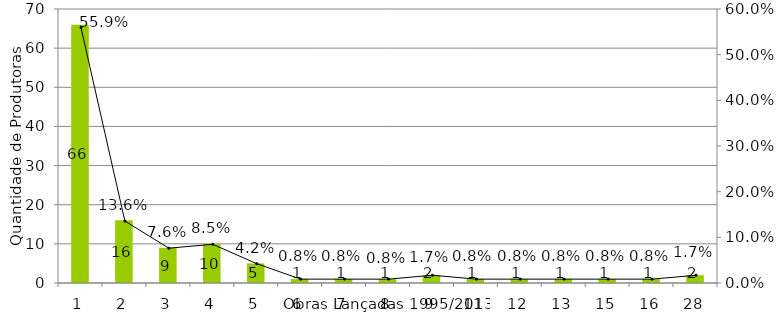
| Category | QTD de Produtoras |
|---|---|
| 1.0 | 66 |
| 2.0 | 16 |
| 3.0 | 9 |
| 4.0 | 10 |
| 5.0 | 5 |
| 6.0 | 1 |
| 7.0 | 1 |
| 8.0 | 1 |
| 9.0 | 2 |
| 11.0 | 1 |
| 12.0 | 1 |
| 13.0 | 1 |
| 15.0 | 1 |
| 16.0 | 1 |
| 28.0 | 2 |